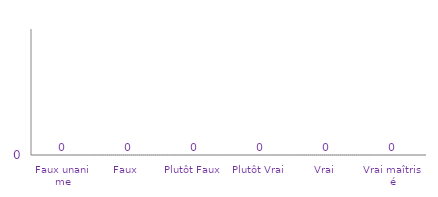
| Category | Histogramme de Véracité BM01 |
|---|---|
| Faux unanime | 0 |
| Faux  | 0 |
| Plutôt Faux | 0 |
| Plutôt Vrai | 0 |
| Vrai  | 0 |
| Vrai maîtrisé | 0 |